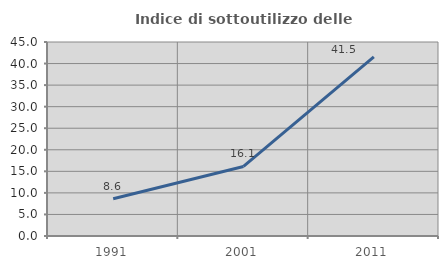
| Category | Indice di sottoutilizzo delle abitazioni  |
|---|---|
| 1991.0 | 8.64 |
| 2001.0 | 16.129 |
| 2011.0 | 41.545 |